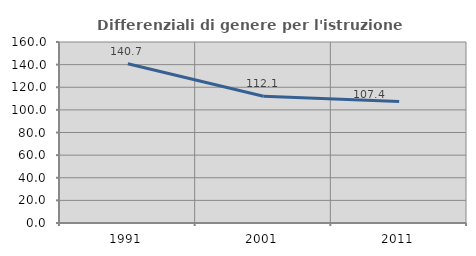
| Category | Differenziali di genere per l'istruzione superiore |
|---|---|
| 1991.0 | 140.725 |
| 2001.0 | 112.063 |
| 2011.0 | 107.413 |